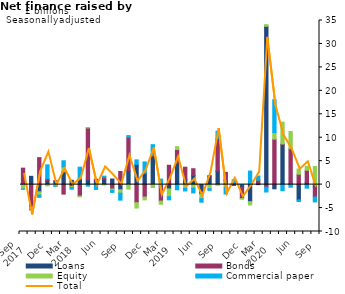
| Category | Loans | Bonds | Equity | Commercial paper |
|---|---|---|---|---|
| Sep 
2017 | -0.041 | 3.51 | -0.893 |  |
|  | 1.766 | -4.847 | -0.369 |  |
|  | -1.539 | 5.749 | -0.676 |  |
| Dec | 0.879 | 0.379 | -0.27 |  |
|  | 0.751 | 0.093 | -0.262 |  |
|  | 2.757 | -2.027 | 1.016 |  |
| Mar 
2018 | 0.921 | -0.433 | -0.188 |  |
|  | 1.182 | -2.435 | -0.171 |  |
|  | 1.054 | 11.031 | 0.112 |  |
| Jun | 0.857 | 0.294 | -0.049 |  |
|  | 1.079 | 0.494 | -0.034 |  |
|  | 1.193 | -0.932 | -0.305 |  |
| Sep | -1.091 | 2.795 | -0.74 |  |
|  | 2.948 | 7.138 | -0.957 |  |
|  | 4.314 | -3.846 | -1.157 |  |
| Dec | 2.428 | -2.65 | -0.599 |  |
|  | 6.046 | 0.161 | -0.627 |  |
|  | -0.436 | -3.084 | -0.665 |  |
| Mar 
2019 | -0.915 | 4.131 | -1.65 |  |
|  | 4.574 | 2.92 | 0.602 |  |
|  | 1.093 | 2.622 | -0.794 |  |
| Jun | 1.953 | 1.437 | -0.762 |  |
|  | -1.77 | -0.281 | -0.955 |  |
|  | 1.763 | 0.174 | -0.884 |  |
| Sep | 2.865 | 6.981 | -0.141 |  |
|  | 0.955 | 1.651 | -0.588 |  |
|  | 0.382 | -0.195 | 0.017 |  |
| Dec | -0.557 | -2.415 | -0.139 |  |
|  | -3.635 | 0.155 | -0.707 |  |
|  | 0.236 | 0.764 | 0.004 |  |
| Mar 
2020 | 33.763 | -0.54 | 0.348 |  |
|  | -0.892 | 9.698 | 1.39 |  |
|  | 8.539 | 0.131 | 4.651 |  |
| Jun | 0.162 | 7.494 | 3.673 |  |
|  | -3.265 | 2.212 | 1.121 |  |
|  | 0.439 | 2.614 | 0.86 |  |
| Sep | -0.51 | -2.122 | 3.886 |  |